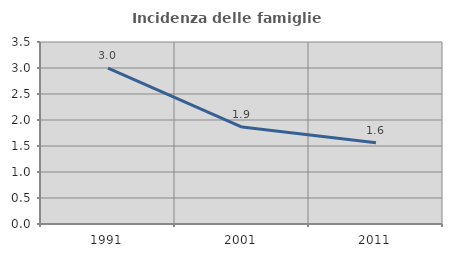
| Category | Incidenza delle famiglie numerose |
|---|---|
| 1991.0 | 2.998 |
| 2001.0 | 1.863 |
| 2011.0 | 1.562 |